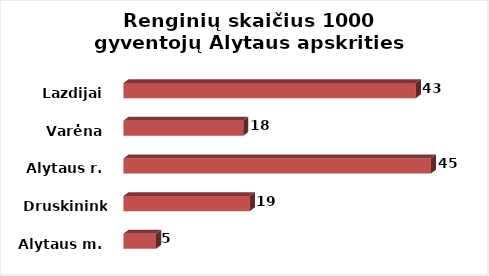
| Category | Series 0 |
|---|---|
| Alytaus m. | 4.793 |
| Druskininkai | 18.567 |
| Alytaus r. | 45.174 |
| Varėna | 17.598 |
| Lazdijai | 42.951 |